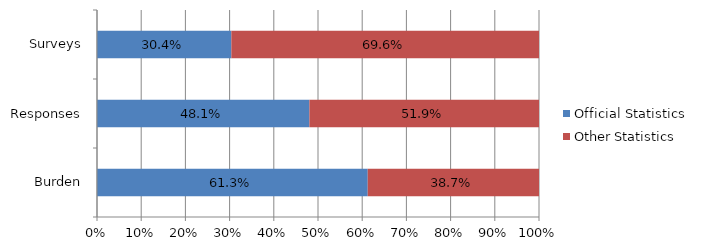
| Category | Official Statistics | Other Statistics |
|---|---|---|
| Burden | 0.613 | 0.387 |
| Responses | 0.481 | 0.519 |
| Surveys | 0.304 | 0.696 |